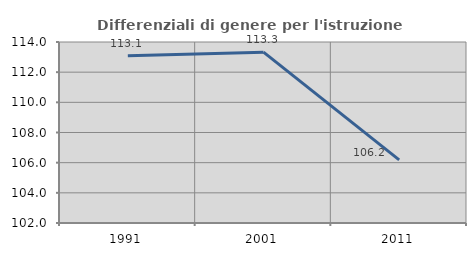
| Category | Differenziali di genere per l'istruzione superiore |
|---|---|
| 1991.0 | 113.086 |
| 2001.0 | 113.328 |
| 2011.0 | 106.182 |